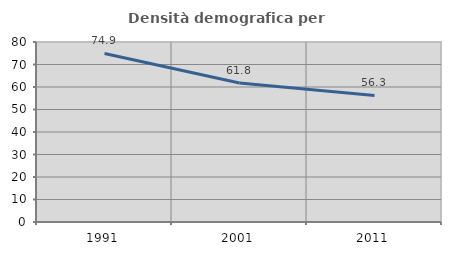
| Category | Densità demografica |
|---|---|
| 1991.0 | 74.905 |
| 2001.0 | 61.813 |
| 2011.0 | 56.261 |